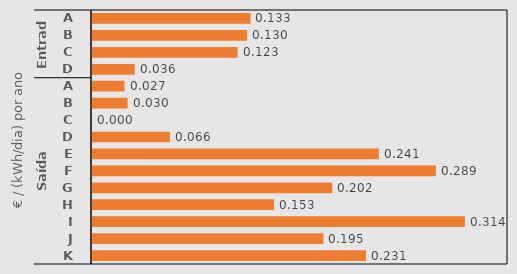
| Category | Preços pré-equalização |
|---|---|
| 0 | 0.133 |
| 1 | 0.13 |
| 2 | 0.123 |
| 3 | 0.036 |
| 4 | 0.027 |
| 5 | 0.03 |
| 6 | 0 |
| 7 | 0.066 |
| 8 | 0.241 |
| 9 | 0.289 |
| 10 | 0.202 |
| 11 | 0.153 |
| 12 | 0.314 |
| 13 | 0.195 |
| 14 | 0.231 |